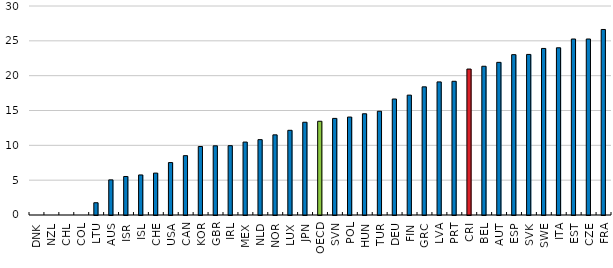
| Category | Series 0 |
|---|---|
| DNK | 0 |
| NZL | 0 |
| CHL | 0 |
| COL | 0 |
| LTU | 1.759 |
| AUS | 5.043 |
| ISR | 5.529 |
| ISL | 5.749 |
| CHE | 6.015 |
| USA | 7.525 |
| CAN | 8.516 |
| KOR | 9.833 |
| GBR | 9.931 |
| IRL | 9.95 |
| MEX | 10.469 |
| NLD | 10.815 |
| NOR | 11.504 |
| LUX | 12.157 |
| JPN | 13.315 |
| OECD | 13.456 |
| SVN | 13.867 |
| POL | 14.06 |
| HUN | 14.53 |
| TUR | 14.894 |
| DEU | 16.649 |
| FIN | 17.205 |
| GRC | 18.394 |
| LVA | 19.106 |
| PRT | 19.192 |
| CRI | 20.949 |
| BEL | 21.35 |
| AUT | 21.911 |
| ESP | 23.018 |
| SVK | 23.047 |
| SWE | 23.908 |
| ITA | 24.001 |
| EST | 25.262 |
| CZE | 25.262 |
| FRA | 26.63 |